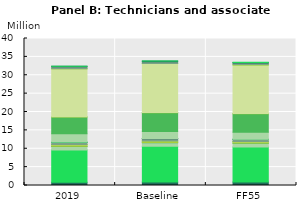
| Category | Agriculture and food | Business services | Construction | Dwellings | Electric equipment | Fossil fuels | Hydro power | Land transport | Minerals n.e.s. | Nuclear power | Other Manufacturing | Other services | Power transm. & distr. | Public services | Solar power | Transport equipement | Water collection and distr. | Wind power |
|---|---|---|---|---|---|---|---|---|---|---|---|---|---|---|---|---|---|---|
| 2019 | 0.902 | 8.765 | 0.947 | 0.058 | 0.407 | 0.08 | 0.011 | 0.539 | 0.066 | 0.041 | 2.276 | 4.538 | 0.074 | 13.056 | 0.007 | 0.519 | 0.174 | 0.022 |
| Baseline | 0.94 | 9.734 | 0.974 | 0.069 | 0.36 | 0.044 | 0.011 | 0.565 | 0.066 | 0.035 | 1.926 | 5.086 | 0.075 | 13.301 | 0.021 | 0.479 | 0.177 | 0.046 |
| FF55 | 0.928 | 9.58 | 0.968 | 0.069 | 0.376 | 0.017 | 0.01 | 0.539 | 0.063 | 0.034 | 1.936 | 4.992 | 0.067 | 13.226 | 0.029 | 0.48 | 0.175 | 0.069 |